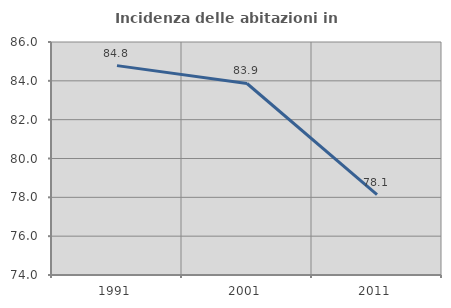
| Category | Incidenza delle abitazioni in proprietà  |
|---|---|
| 1991.0 | 84.783 |
| 2001.0 | 83.863 |
| 2011.0 | 78.141 |